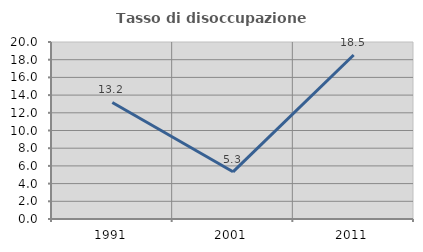
| Category | Tasso di disoccupazione giovanile  |
|---|---|
| 1991.0 | 13.167 |
| 2001.0 | 5.333 |
| 2011.0 | 18.533 |